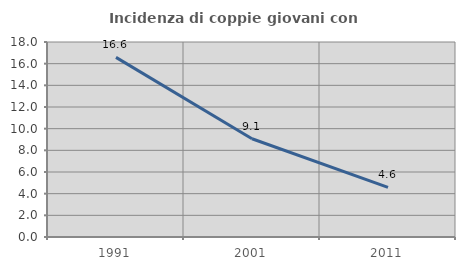
| Category | Incidenza di coppie giovani con figli |
|---|---|
| 1991.0 | 16.579 |
| 2001.0 | 9.069 |
| 2011.0 | 4.575 |